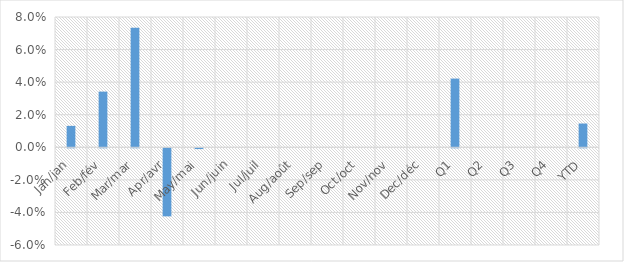
| Category | Total YoY % Change |
|---|---|
| Jan/jan | 0.013 |
| Feb/fév | 0.034 |
| Mar/mar | 0.073 |
| Apr/avr | -0.042 |
| May/mai | 0 |
| Jun/juin | 0 |
| Jul/juil | 0 |
| Aug/août | 0 |
| Sep/sep | 0 |
| Oct/oct | 0 |
| Nov/nov | 0 |
| Dec/déc | 0 |
| Q1 | 0.042 |
| Q2 | 0 |
| Q3 | 0 |
| Q4 | 0 |
| YTD | 0.015 |